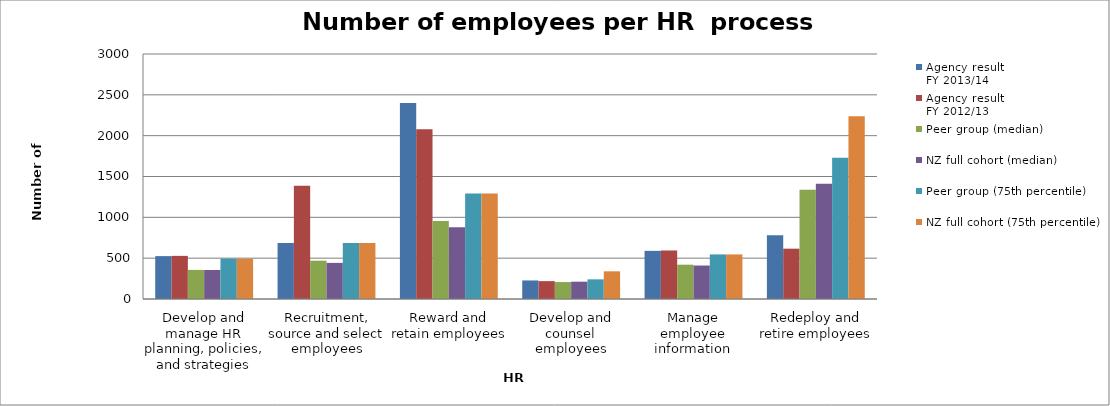
| Category | Agency result
FY 2013/14 | Agency result
FY 2012/13 | Peer group (median) | NZ full cohort (median) | Peer group (75th percentile) | NZ full cohort (75th percentile) |
|---|---|---|---|---|---|---|
| Develop and manage HR planning, policies, and strategies | 525 | 528.254 | 356.216 | 355.441 | 494.343 | 493.565 |
| Recruitment, source and select employees | 685.714 | 1386.667 | 469.094 | 442.249 | 684.506 | 684.506 |
| Reward and retain employees | 2400 | 2080 | 956.484 | 879.906 | 1293.146 | 1293.146 |
| Develop and counsel employees | 227.027 | 218.947 | 207.415 | 211.9 | 240.733 | 338.973 |
| Manage employee information | 589.474 | 594.286 | 420.052 | 409.714 | 545.939 | 545.939 |
| Redeploy and retire employees | 781.395 | 616.296 | 1337.14 | 1409.853 | 1729.643 | 2236.305 |